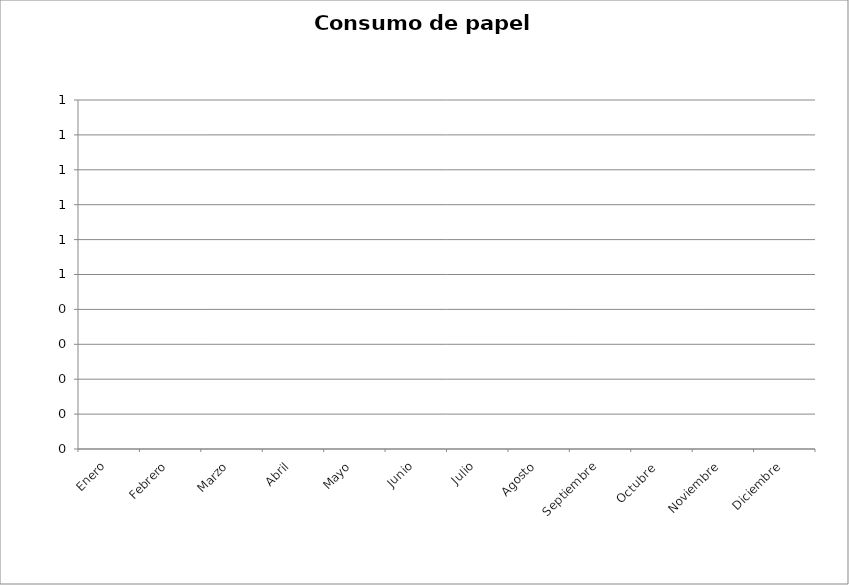
| Category | Series 0 |
|---|---|
| Enero | 0 |
| Febrero | 0 |
| Marzo | 0 |
| Abril | 0 |
| Mayo | 0 |
| Junio | 0 |
| Julio | 0 |
| Agosto | 0 |
| Septiembre | 0 |
| Octubre  | 0 |
| Noviembre | 0 |
| Diciembre | 0 |